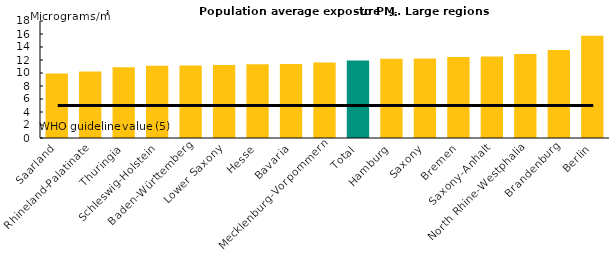
| Category | Annual average exposure |
|---|---|
| Saarland | 9.91 |
| Rhineland-Palatinate | 10.243 |
| Thuringia | 10.9 |
| Schleswig-Holstein | 11.108 |
| Baden-Württemberg | 11.152 |
| Lower Saxony | 11.241 |
| Hesse | 11.361 |
| Bavaria | 11.388 |
| Mecklenburg-Vorpommern | 11.602 |
| Total | 11.928 |
| Hamburg | 12.174 |
| Saxony | 12.226 |
| Bremen | 12.471 |
| Saxony-Anhalt | 12.544 |
| North Rhine-Westphalia | 12.924 |
| Brandenburg | 13.544 |
| Berlin | 15.739 |